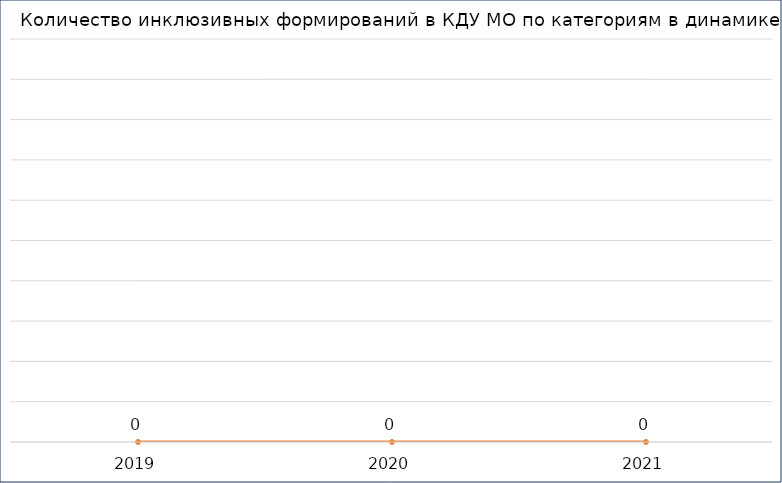
| Category | количество инклюзивных формирований |
|---|---|
| 2019.0 | 0 |
| 2020.0 | 0 |
| 2021.0 | 0 |